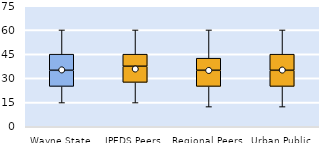
| Category | 25th | 50th | 75th |
|---|---|---|---|
| Wayne State | 25 | 10 | 10 |
| IPEDS Peers | 27.5 | 10 | 7.5 |
| Regional Peers | 25 | 10 | 7.5 |
| Urban Public | 25 | 10 | 10 |